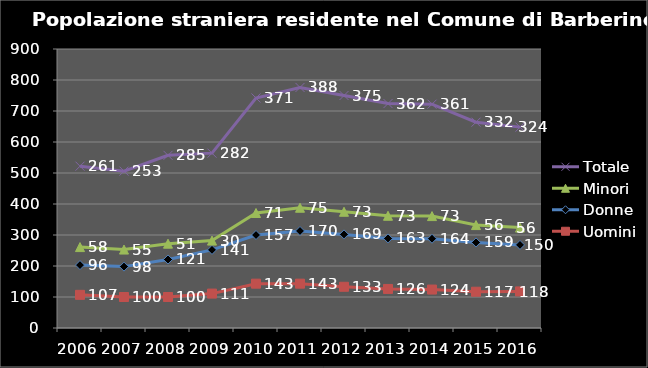
| Category | Uomini | Donne | Minori | Totale |
|---|---|---|---|---|
| 2006.0 | 107 | 96 | 58 | 261 |
| 2007.0 | 100 | 98 | 55 | 253 |
| 2008.0 | 100 | 121 | 51 | 285 |
| 2009.0 | 111 | 141 | 30 | 282 |
| 2010.0 | 143 | 157 | 71 | 371 |
| 2011.0 | 143 | 170 | 75 | 388 |
| 2012.0 | 133 | 169 | 73 | 375 |
| 2013.0 | 126 | 163 | 73 | 362 |
| 2014.0 | 124 | 164 | 73 | 361 |
| 2015.0 | 117 | 159 | 56 | 332 |
| 2016.0 | 118 | 150 | 56 | 324 |